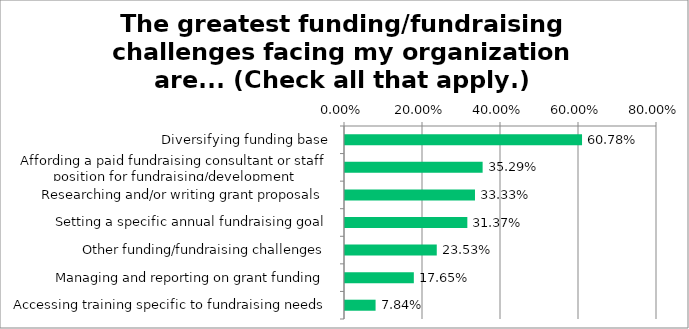
| Category | Responses |
|---|---|
| Diversifying funding base | 0.608 |
| Affording a paid fundraising consultant or staff position for fundraising/development | 0.353 |
| Researching and/or writing grant proposals | 0.333 |
| Setting a specific annual fundraising goal | 0.314 |
| Other funding/fundraising challenges | 0.235 |
| Managing and reporting on grant funding | 0.176 |
| Accessing training specific to fundraising needs | 0.078 |